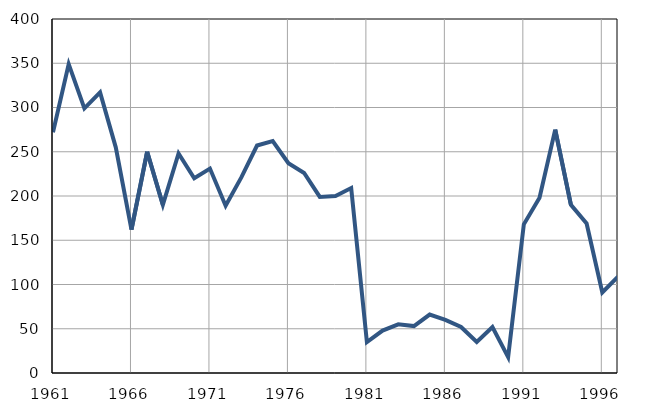
| Category | Infants
deaths |
|---|---|
| 1961.0 | 272 |
| 1962.0 | 349 |
| 1963.0 | 299 |
| 1964.0 | 317 |
| 1965.0 | 255 |
| 1966.0 | 162 |
| 1967.0 | 250 |
| 1968.0 | 190 |
| 1969.0 | 248 |
| 1970.0 | 220 |
| 1971.0 | 231 |
| 1972.0 | 189 |
| 1973.0 | 221 |
| 1974.0 | 257 |
| 1975.0 | 262 |
| 1976.0 | 237 |
| 1977.0 | 226 |
| 1978.0 | 199 |
| 1979.0 | 200 |
| 1980.0 | 209 |
| 1981.0 | 35 |
| 1982.0 | 48 |
| 1983.0 | 55 |
| 1984.0 | 53 |
| 1985.0 | 66 |
| 1986.0 | 60 |
| 1987.0 | 52 |
| 1988.0 | 35 |
| 1989.0 | 52 |
| 1990.0 | 18 |
| 1991.0 | 168 |
| 1992.0 | 198 |
| 1993.0 | 275 |
| 1994.0 | 190 |
| 1995.0 | 169 |
| 1996.0 | 91 |
| 1997.0 | 109 |